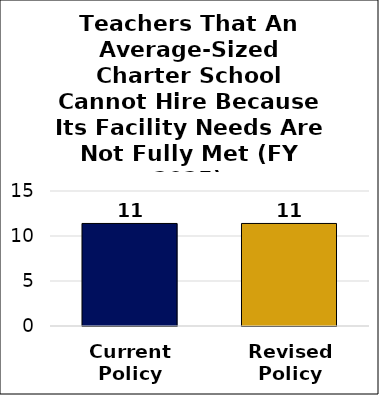
| Category | Number of Additional Teachers Hired |
|---|---|
| Current
Policy | 11.393 |
| Revised
Policy | 11.393 |